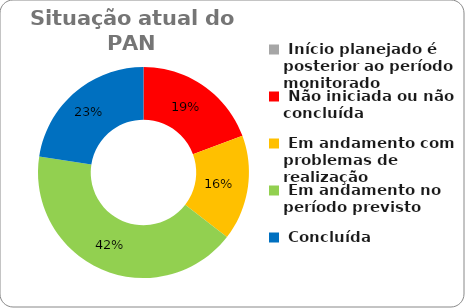
| Category | Series 0 |
|---|---|
|  Início planejado é posterior ao período monitorado | 0 |
|  Não iniciada ou não concluída | 0.194 |
|  Em andamento com problemas de realização | 0.161 |
|  Em andamento no período previsto  | 0.419 |
|  Concluída | 0.226 |